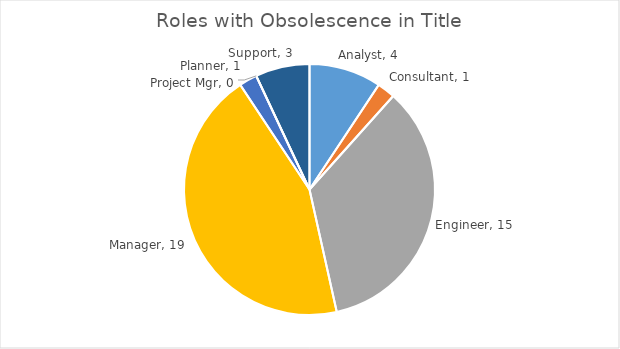
| Category | Qty |
|---|---|
| Analyst | 4 |
| Consultant | 1 |
| Engineer | 15 |
| Manager | 19 |
| Planner | 1 |
| Project Mgr | 0 |
| Support | 3 |